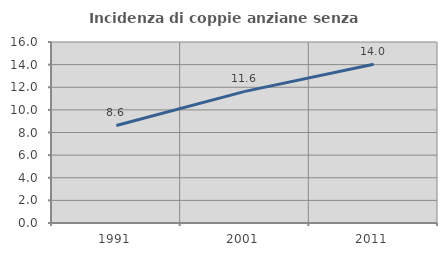
| Category | Incidenza di coppie anziane senza figli  |
|---|---|
| 1991.0 | 8.624 |
| 2001.0 | 11.633 |
| 2011.0 | 14.039 |